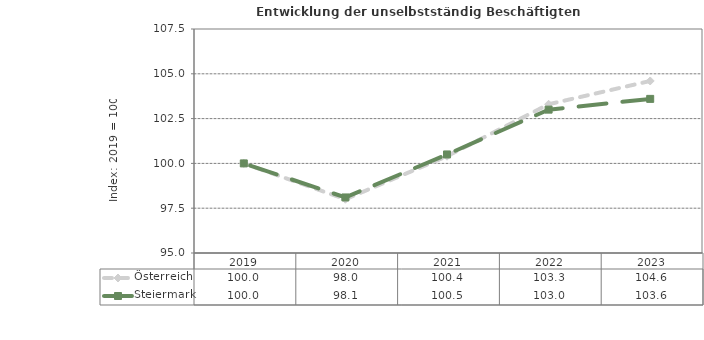
| Category | Österreich | Steiermark |
|---|---|---|
| 2023.0 | 104.6 | 103.6 |
| 2022.0 | 103.3 | 103 |
| 2021.0 | 100.4 | 100.5 |
| 2020.0 | 98 | 98.1 |
| 2019.0 | 100 | 100 |